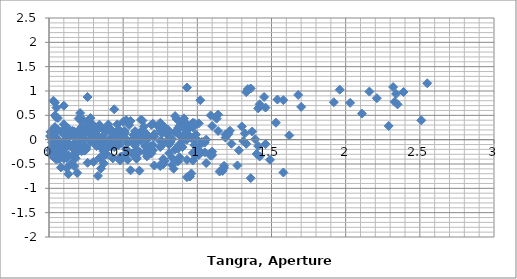
| Category | Series 0 |
|---|---|
| 0.03999999999999915 | 0.762 |
| 0.16000000000000014 | 0.18 |
| 0.1999999999999993 | 0.434 |
| 0.20999999999999908 | 0.218 |
| 0.22000000000000064 | 0.379 |
| 0.23000000000000043 | 0.078 |
| 0.2599999999999998 | 0.877 |
| 0.33999999999999986 | 0.307 |
| 0.39000000000000057 | 0.17 |
| 0.4399999999999995 | 0.624 |
| 0.5199999999999996 | 0.403 |
| 0.5899999999999999 | 0.132 |
| 0.629999999999999 | 0.39 |
| 0.8499999999999996 | 0.485 |
| 0.8699999999999992 | 0.24 |
| 0.9700000000000006 | 0.346 |
| 1.0099999999999998 | 0.335 |
| 1.0899999999999999 | 0.499 |
| 1.0999999999999996 | 0.281 |
| 1.129999999999999 | 0.432 |
| 1.1400000000000006 | 0.516 |
| 1.1899999999999995 | 0.107 |
| 1.209999999999999 | 0.12 |
| 1.2200000000000006 | 0.183 |
| 1.5299999999999994 | 0.348 |
| 1.6199999999999992 | 0.087 |
| 2.5500000000000007 | 1.159 |
| 0.120000000000001 | -0.582 |
| 0.16000000000000014 | -0.328 |
| 0.16999999999999993 | -0.543 |
| 0.1800000000000015 | -0.383 |
| 0.19000000000000128 | -0.684 |
| 0.22000000000000064 | 0.116 |
| 0.3000000000000007 | -0.455 |
| 0.3500000000000014 | -0.591 |
| 0.40000000000000036 | -0.137 |
| 0.4800000000000004 | -0.359 |
| 0.5500000000000007 | -0.629 |
| 0.5899999999999999 | -0.371 |
| 0.8100000000000005 | -0.277 |
| 0.8300000000000001 | -0.522 |
| 0.9300000000000015 | -0.415 |
| 0.9700000000000006 | -0.427 |
| 1.0500000000000007 | -0.262 |
| 1.0600000000000005 | -0.481 |
| 1.0899999999999999 | -0.329 |
| 1.1000000000000014 | -0.246 |
| 1.1500000000000004 | -0.654 |
| 1.17 | -0.642 |
| 1.1800000000000015 | -0.579 |
| 1.4900000000000002 | -0.413 |
| 1.58 | -0.674 |
| 2.5100000000000016 | 0.397 |
| 0.03999999999999915 | 0.254 |
| 0.049999999999998934 | 0.039 |
| 0.0600000000000005 | 0.199 |
| 0.07000000000000028 | -0.102 |
| 0.09999999999999964 | 0.697 |
| 0.17999999999999972 | 0.127 |
| 0.23000000000000043 | -0.009 |
| 0.27999999999999936 | 0.444 |
| 0.35999999999999943 | 0.223 |
| 0.4299999999999997 | -0.047 |
| 0.46999999999999886 | 0.211 |
| 0.6899999999999995 | 0.305 |
| 0.7099999999999991 | 0.06 |
| 0.8100000000000005 | 0.166 |
| 0.8499999999999996 | 0.155 |
| 0.9299999999999997 | 0.32 |
| 0.9399999999999995 | 0.101 |
| 0.9699999999999989 | 0.252 |
| 0.9800000000000004 | 0.336 |
| 1.0299999999999994 | -0.073 |
| 1.049999999999999 | -0.06 |
| 1.0600000000000005 | 0.003 |
| 1.3699999999999992 | 0.168 |
| 1.459999999999999 | -0.092 |
| 2.3900000000000006 | 0.979 |
| 0.009999999999999787 | -0.215 |
| 0.02000000000000135 | -0.055 |
| 0.030000000000001137 | -0.356 |
| 0.0600000000000005 | 0.444 |
| 0.14000000000000057 | -0.127 |
| 0.19000000000000128 | -0.263 |
| 0.2400000000000002 | 0.191 |
| 0.3200000000000003 | -0.031 |
| 0.39000000000000057 | -0.301 |
| 0.4299999999999997 | -0.043 |
| 0.6500000000000004 | 0.051 |
| 0.6699999999999999 | -0.194 |
| 0.7700000000000014 | -0.087 |
| 0.8100000000000005 | -0.099 |
| 0.8900000000000006 | 0.066 |
| 0.9000000000000004 | -0.153 |
| 0.9299999999999997 | -0.001 |
| 0.9400000000000013 | 0.082 |
| 0.9900000000000002 | -0.326 |
| 1.0099999999999998 | -0.314 |
| 1.0200000000000014 | -0.251 |
| 1.33 | -0.085 |
| 1.42 | -0.346 |
| 2.3500000000000014 | 0.725 |
| 0.010000000000001563 | 0.16 |
| 0.02000000000000135 | -0.141 |
| 0.05000000000000071 | 0.659 |
| 0.13000000000000078 | 0.088 |
| 0.1800000000000015 | -0.048 |
| 0.23000000000000043 | 0.406 |
| 0.3100000000000005 | 0.184 |
| 0.3800000000000008 | -0.086 |
| 0.41999999999999993 | 0.172 |
| 0.6400000000000006 | 0.266 |
| 0.6600000000000001 | 0.021 |
| 0.7600000000000016 | 0.128 |
| 0.8000000000000007 | 0.117 |
| 0.8800000000000008 | 0.281 |
| 0.8900000000000006 | 0.062 |
| 0.9199999999999999 | 0.214 |
| 0.9300000000000015 | 0.297 |
| 0.9800000000000004 | -0.111 |
| 1.0 | -0.099 |
| 1.0100000000000016 | -0.036 |
| 1.3200000000000003 | 0.13 |
| 1.4100000000000001 | -0.131 |
| 2.3400000000000016 | 0.94 |
| 0.009999999999999787 | -0.301 |
| 0.03999999999999915 | 0.498 |
| 0.11999999999999922 | -0.072 |
| 0.16999999999999993 | -0.208 |
| 0.21999999999999886 | 0.246 |
| 0.29999999999999893 | 0.024 |
| 0.3699999999999992 | -0.246 |
| 0.40999999999999837 | 0.012 |
| 0.629999999999999 | 0.106 |
| 0.6499999999999986 | -0.139 |
| 0.75 | -0.032 |
| 0.7899999999999991 | -0.044 |
| 0.8699999999999992 | 0.121 |
| 0.879999999999999 | -0.098 |
| 0.9099999999999984 | 0.053 |
| 0.9199999999999999 | 0.137 |
| 0.9699999999999989 | -0.272 |
| 0.9899999999999984 | -0.259 |
| 1.0 | -0.196 |
| 1.3099999999999987 | -0.031 |
| 1.3999999999999986 | -0.291 |
| 2.33 | 0.78 |
| 0.02999999999999936 | 0.8 |
| 0.10999999999999943 | 0.229 |
| 0.16000000000000014 | 0.093 |
| 0.20999999999999908 | 0.547 |
| 0.28999999999999915 | 0.325 |
| 0.35999999999999943 | 0.055 |
| 0.3999999999999986 | 0.313 |
| 0.6199999999999992 | 0.407 |
| 0.6399999999999988 | 0.162 |
| 0.7400000000000002 | 0.269 |
| 0.7799999999999994 | 0.257 |
| 0.8599999999999994 | 0.422 |
| 0.8699999999999992 | 0.203 |
| 0.8999999999999986 | 0.355 |
| 0.9100000000000001 | 0.438 |
| 0.9599999999999991 | 0.03 |
| 0.9799999999999986 | 0.042 |
| 0.9900000000000002 | 0.105 |
| 1.299999999999999 | 0.271 |
| 1.3899999999999988 | 0.01 |
| 2.3200000000000003 | 1.081 |
| 0.08000000000000007 | -0.57 |
| 0.13000000000000078 | -0.707 |
| 0.17999999999999972 | -0.253 |
| 0.2599999999999998 | -0.475 |
| 0.33000000000000007 | -0.745 |
| 0.3699999999999992 | -0.487 |
| 0.5899999999999999 | -0.392 |
| 0.6099999999999994 | -0.637 |
| 0.7100000000000009 | -0.531 |
| 0.75 | -0.542 |
| 0.8300000000000001 | -0.378 |
| 0.8399999999999999 | -0.596 |
| 0.8699999999999992 | -0.445 |
| 0.8800000000000008 | -0.361 |
| 0.9299999999999997 | -0.77 |
| 0.9499999999999993 | -0.757 |
| 0.9600000000000009 | -0.694 |
| 1.2699999999999996 | -0.529 |
| 1.3599999999999994 | -0.79 |
| 2.290000000000001 | 0.282 |
| 0.05000000000000071 | -0.136 |
| 0.09999999999999964 | 0.318 |
| 0.17999999999999972 | 0.096 |
| 0.25 | -0.174 |
| 0.28999999999999915 | 0.084 |
| 0.5099999999999998 | 0.178 |
| 0.5299999999999994 | -0.067 |
| 0.6300000000000008 | 0.04 |
| 0.6699999999999999 | 0.028 |
| 0.75 | 0.193 |
| 0.7599999999999998 | -0.026 |
| 0.7899999999999991 | 0.125 |
| 0.8000000000000007 | 0.209 |
| 0.8499999999999996 | -0.2 |
| 0.8699999999999992 | -0.187 |
| 0.8800000000000008 | -0.124 |
| 1.1899999999999995 | 0.041 |
| 1.2799999999999994 | -0.219 |
| 2.210000000000001 | 0.852 |
| 0.049999999999998934 | 0.454 |
| 0.129999999999999 | 0.232 |
| 0.1999999999999993 | -0.038 |
| 0.23999999999999844 | 0.22 |
| 0.4599999999999991 | 0.314 |
| 0.47999999999999865 | 0.069 |
| 0.5800000000000001 | 0.176 |
| 0.6199999999999992 | 0.164 |
| 0.6999999999999993 | 0.329 |
| 0.7099999999999991 | 0.11 |
| 0.7399999999999984 | 0.262 |
| 0.75 | 0.345 |
| 0.7999999999999989 | -0.063 |
| 0.8199999999999985 | -0.051 |
| 0.8300000000000001 | 0.012 |
| 1.1399999999999988 | 0.178 |
| 1.2299999999999986 | -0.083 |
| 2.16 | 0.988 |
| 0.08000000000000007 | -0.222 |
| 0.15000000000000036 | -0.492 |
| 0.1899999999999995 | -0.234 |
| 0.41000000000000014 | -0.139 |
| 0.4299999999999997 | -0.384 |
| 0.5300000000000011 | -0.278 |
| 0.5700000000000003 | -0.289 |
| 0.6500000000000004 | -0.125 |
| 0.6600000000000001 | -0.343 |
| 0.6899999999999995 | -0.192 |
| 0.7000000000000011 | -0.108 |
| 0.75 | -0.517 |
| 0.7699999999999996 | -0.505 |
| 0.7800000000000011 | -0.441 |
| 1.0899999999999999 | -0.276 |
| 1.1799999999999997 | -0.537 |
| 2.110000000000001 | 0.535 |
| 0.07000000000000028 | -0.27 |
| 0.10999999999999943 | -0.012 |
| 0.33000000000000007 | 0.082 |
| 0.34999999999999964 | -0.163 |
| 0.45000000000000107 | -0.056 |
| 0.4900000000000002 | -0.068 |
| 0.5700000000000003 | 0.097 |
| 0.5800000000000001 | -0.122 |
| 0.6099999999999994 | 0.03 |
| 0.620000000000001 | 0.113 |
| 0.6699999999999999 | -0.295 |
| 0.6899999999999995 | -0.283 |
| 0.7000000000000011 | -0.22 |
| 1.0099999999999998 | -0.054 |
| 1.0999999999999996 | -0.315 |
| 2.030000000000001 | 0.756 |
| 0.03999999999999915 | 0.258 |
| 0.2599999999999998 | 0.352 |
| 0.27999999999999936 | 0.107 |
| 0.3800000000000008 | 0.214 |
| 0.41999999999999993 | 0.203 |
| 0.5 | 0.367 |
| 0.5099999999999998 | 0.149 |
| 0.5399999999999991 | 0.3 |
| 0.5500000000000007 | 0.383 |
| 0.5999999999999996 | -0.025 |
| 0.6199999999999992 | -0.013 |
| 0.6300000000000008 | 0.05 |
| 0.9399999999999995 | 0.216 |
| 1.0299999999999994 | -0.045 |
| 1.9600000000000009 | 1.026 |
| 0.22000000000000064 | 0.094 |
| 0.2400000000000002 | -0.151 |
| 0.34000000000000163 | -0.044 |
| 0.3800000000000008 | -0.055 |
| 0.46000000000000085 | 0.109 |
| 0.47000000000000064 | -0.109 |
| 0.5 | 0.042 |
| 0.5100000000000016 | 0.126 |
| 0.5600000000000005 | -0.283 |
| 0.5800000000000001 | -0.271 |
| 0.5900000000000016 | -0.208 |
| 0.9000000000000004 | -0.042 |
| 0.9900000000000002 | -0.303 |
| 1.9200000000000017 | 0.769 |
| 0.019999999999999574 | -0.245 |
| 0.120000000000001 | -0.139 |
| 0.16000000000000014 | -0.15 |
| 0.2400000000000002 | 0.015 |
| 0.25 | -0.204 |
| 0.27999999999999936 | -0.053 |
| 0.2900000000000009 | 0.031 |
| 0.33999999999999986 | -0.378 |
| 0.35999999999999943 | -0.365 |
| 0.370000000000001 | -0.302 |
| 0.6799999999999997 | -0.137 |
| 0.7699999999999996 | -0.397 |
| 1.700000000000001 | 0.674 |
| 0.10000000000000142 | 0.106 |
| 0.14000000000000057 | 0.095 |
| 0.22000000000000064 | 0.26 |
| 0.23000000000000043 | 0.041 |
| 0.2599999999999998 | 0.192 |
| 0.27000000000000135 | 0.276 |
| 0.3200000000000003 | -0.133 |
| 0.33999999999999986 | -0.12 |
| 0.3500000000000014 | -0.057 |
| 0.6600000000000001 | 0.108 |
| 0.75 | -0.152 |
| 1.6800000000000015 | 0.919 |
| 0.03999999999999915 | -0.011 |
| 0.11999999999999922 | 0.153 |
| 0.129999999999999 | -0.065 |
| 0.15999999999999837 | 0.086 |
| 0.16999999999999993 | 0.17 |
| 0.21999999999999886 | -0.239 |
| 0.23999999999999844 | -0.227 |
| 0.25 | -0.163 |
| 0.5599999999999987 | 0.002 |
| 0.6499999999999986 | -0.259 |
| 1.58 | 0.813 |
| 0.08000000000000007 | 0.164 |
| 0.08999999999999986 | -0.054 |
| 0.11999999999999922 | 0.097 |
| 0.13000000000000078 | 0.181 |
| 0.17999999999999972 | -0.228 |
| 0.1999999999999993 | -0.215 |
| 0.21000000000000085 | -0.152 |
| 0.5199999999999996 | 0.013 |
| 0.6099999999999994 | -0.248 |
| 1.540000000000001 | 0.824 |
| 0.009999999999999787 | -0.219 |
| 0.03999999999999915 | -0.067 |
| 0.05000000000000071 | 0.016 |
| 0.09999999999999964 | -0.392 |
| 0.11999999999999922 | -0.38 |
| 0.13000000000000078 | -0.317 |
| 0.4399999999999995 | -0.151 |
| 0.5299999999999994 | -0.412 |
| 1.4600000000000009 | 0.659 |
| 0.02999999999999936 | 0.151 |
| 0.040000000000000924 | 0.235 |
| 0.08999999999999986 | -0.174 |
| 0.10999999999999943 | -0.161 |
| 0.120000000000001 | -0.098 |
| 0.4299999999999997 | 0.067 |
| 0.5199999999999996 | -0.194 |
| 1.450000000000001 | 0.878 |
| 0.010000000000001563 | 0.084 |
| 0.0600000000000005 | -0.325 |
| 0.08000000000000007 | -0.313 |
| 0.09000000000000163 | -0.249 |
| 0.40000000000000036 | -0.084 |
| 0.4900000000000002 | -0.345 |
| 1.4200000000000017 | 0.727 |
| 0.049999999999998934 | -0.409 |
| 0.06999999999999851 | -0.396 |
| 0.08000000000000007 | -0.333 |
| 0.3899999999999988 | -0.168 |
| 0.47999999999999865 | -0.429 |
| 1.4100000000000001 | 0.643 |
| 0.019999999999999574 | 0.013 |
| 0.030000000000001137 | 0.076 |
| 0.33999999999999986 | 0.241 |
| 0.4299999999999997 | -0.02 |
| 1.3600000000000012 | 1.052 |
| 0.010000000000001563 | 0.063 |
| 0.3200000000000003 | 0.228 |
| 0.41000000000000014 | -0.032 |
| 1.3400000000000016 | 1.039 |
| 0.3099999999999987 | 0.165 |
| 0.3999999999999986 | -0.095 |
| 1.33 | 0.976 |
| 0.08999999999999986 | -0.261 |
| 1.0200000000000014 | 0.811 |
| 0.9300000000000015 | 1.072 |